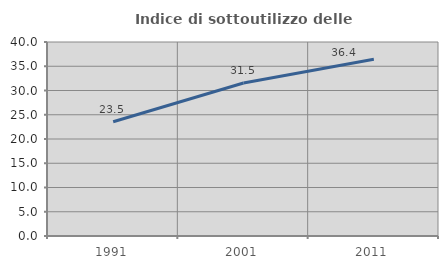
| Category | Indice di sottoutilizzo delle abitazioni  |
|---|---|
| 1991.0 | 23.549 |
| 2001.0 | 31.537 |
| 2011.0 | 36.435 |